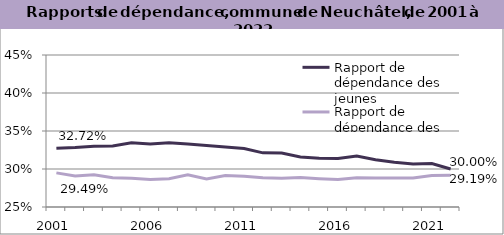
| Category | Rapport de dépendance des jeunes | Rapport de dépendance des personnes âgées |
|---|---|---|
| 2001.0 | 0.327 | 0.295 |
| 2002.0 | 0.328 | 0.291 |
| 2003.0 | 0.33 | 0.292 |
| 2004.0 | 0.33 | 0.289 |
| 2005.0 | 0.335 | 0.288 |
| 2006.0 | 0.333 | 0.286 |
| 2007.0 | 0.334 | 0.287 |
| 2008.0 | 0.333 | 0.292 |
| 2009.0 | 0.331 | 0.287 |
| 2010.0 | 0.329 | 0.291 |
| 2011.0 | 0.327 | 0.291 |
| 2012.0 | 0.321 | 0.289 |
| 2013.0 | 0.321 | 0.288 |
| 2014.0 | 0.316 | 0.289 |
| 2015.0 | 0.314 | 0.287 |
| 2016.0 | 0.314 | 0.286 |
| 2017.0 | 0.317 | 0.288 |
| 2018.0 | 0.312 | 0.288 |
| 2019.0 | 0.309 | 0.288 |
| 2020.0 | 0.306 | 0.288 |
| 2021.0 | 0.307 | 0.292 |
| 2022.0 | 0.3 | 0.292 |